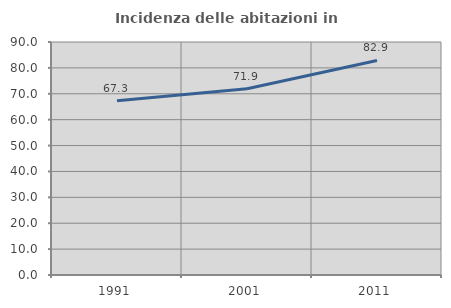
| Category | Incidenza delle abitazioni in proprietà  |
|---|---|
| 1991.0 | 67.327 |
| 2001.0 | 71.939 |
| 2011.0 | 82.883 |